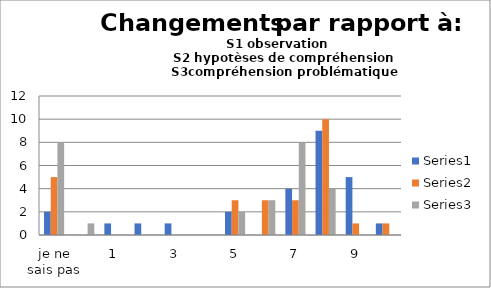
| Category | Series 0 | Series 1 | Series 2 |
|---|---|---|---|
| je ne sais pas | 2 | 5 | 8 |
| 0 | 0 | 0 | 1 |
| 1 | 1 | 0 | 0 |
| 2 | 1 | 0 | 0 |
| 3 | 1 | 0 | 0 |
| 4 | 0 | 0 | 0 |
| 5 | 2 | 3 | 2 |
| 6 | 0 | 3 | 3 |
| 7 | 4 | 3 | 8 |
| 8 | 9 | 10 | 4 |
| 9 | 5 | 1 | 0 |
| 10 | 1 | 1 | 0 |